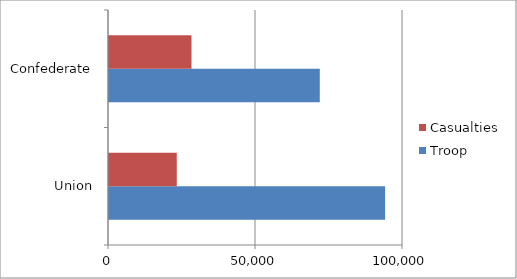
| Category | Troop | Casualties |
|---|---|---|
| Union | 93921 | 23049 |
| Confederate  | 71699 | 28063 |